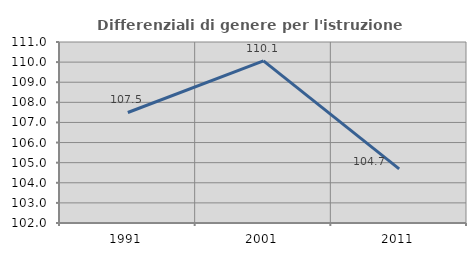
| Category | Differenziali di genere per l'istruzione superiore |
|---|---|
| 1991.0 | 107.495 |
| 2001.0 | 110.063 |
| 2011.0 | 104.694 |